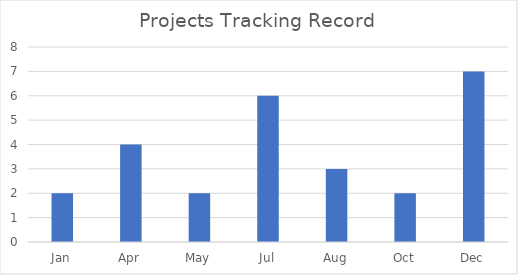
| Category | Series 0 |
|---|---|
| Jan | 2 |
| Apr | 4 |
| May | 2 |
| Jul | 6 |
| Aug | 3 |
| Oct | 2 |
| Dec | 7 |